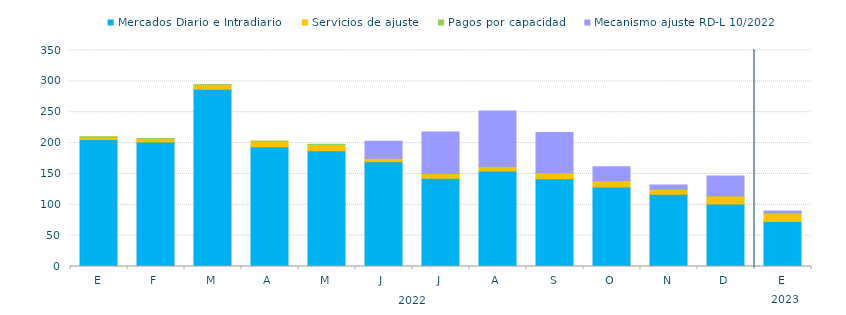
| Category | Mercados Diario e Intradiario  | Servicios de ajuste | Pagos por capacidad | Mecanismo ajuste RD-L 10/2022 |
|---|---|---|---|---|
| E | 205.82 | 3.81 | 0.44 | 0 |
| F | 201.93 | 5.17 | 0.47 | 0 |
| M | 287.13 | 7.05 | 0.33 | 0 |
| A | 194.2 | 8.61 | 0.24 | 0 |
| M | 187.7 | 9.98 | 0.23 | 0 |
| J | 169.63 | 5.62 | 0.25 | 27.54 |
| J | 142.81 | 7.28 | 0.43 | 67.29 |
| A | 154.58 | 7.58 | 0.25 | 89.54 |
| S | 142.21 | 9.54 | 0.25 | 65.19 |
| O | 128.78 | 10.2 | 0.21 | 22.55 |
| N | 117.15 | 7.56 | 0.31 | 7.14 |
| D | 101.28 | 12.8 | 0.42 | 32.09 |
| E | 73.07 | 13.55 | 0.33 | 2.92 |